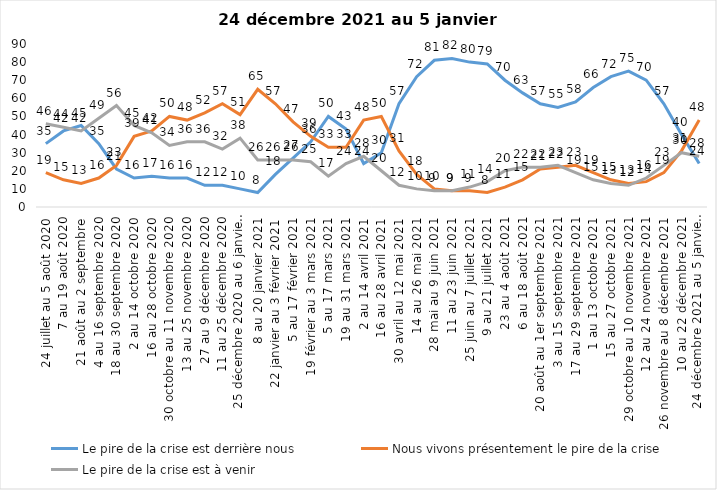
| Category | Le pire de la crise est derrière nous | Nous vivons présentement le pire de la crise | Le pire de la crise est à venir |
|---|---|---|---|
| 24 juillet au 5 août 2020 | 35 | 19 | 46 |
| 7 au 19 août 2020 | 42 | 15 | 44 |
| 21 août au 2 septembre | 45 | 13 | 42 |
| 4 au 16 septembre 2020 | 35 | 16 | 49 |
| 18 au 30 septembre 2020 | 21 | 23 | 56 |
| 2 au 14 octobre 2020 | 16 | 39 | 45 |
| 16 au 28 octobre 2020 | 17 | 42 | 41 |
| 30 octobre au 11 novembre 2020 | 16 | 50 | 34 |
| 13 au 25 novembre 2020 | 16 | 48 | 36 |
| 27 au 9 décembre 2020 | 12 | 52 | 36 |
| 11 au 25 décembre 2020 | 12 | 57 | 32 |
| 25 décembre 2020 au 6 janvier 2021 | 10 | 51 | 38 |
| 8 au 20 janvier 2021 | 8 | 65 | 26 |
| 22 janvier au 3 février 2021 | 18 | 57 | 26 |
| 5 au 17 février 2021 | 27 | 47 | 26 |
| 19 février au 3 mars 2021 | 36 | 39 | 25 |
| 5 au 17 mars 2021 | 50 | 33 | 17 |
| 19 au 31 mars 2021 | 43 | 33 | 24 |
| 2 au 14 avril 2021 | 24 | 48 | 28 |
| 16 au 28 avril 2021 | 30 | 50 | 20 |
| 30 avril au 12 mai 2021 | 57 | 31 | 12 |
| 14 au 26 mai 2021 | 72 | 18 | 10 |
| 28 mai au 9 juin 2021 | 81 | 10 | 9 |
| 11 au 23 juin 2021 | 82 | 9 | 9 |
| 25 juin au 7 juillet 2021 | 80 | 9 | 11 |
| 9 au 21 juillet 2021 | 79 | 8 | 14 |
| 23 au 4 août 2021 | 70 | 11 | 20 |
| 6 au 18 août 2021 | 63 | 15 | 22 |
| 20 août au 1er septembre 2021 | 57 | 21 | 22 |
| 3 au 15 septembre 2021 | 55 | 22 | 23 |
| 17 au 29 septembre 2021 | 58 | 23 | 19 |
| 1 au 13 octobre 2021 | 66 | 19 | 15 |
| 15 au 27 octobre 2021 | 72 | 15 | 13 |
| 29 octobre au 10 novembre 2021 | 75 | 13 | 12 |
| 12 au 24 novembre 2021 | 70 | 14 | 16 |
| 26 novembre au 8 décembre 2021 | 57 | 19 | 23 |
| 10 au 22 décembre 2021 | 40 | 31 | 30 |
| 24 décembre 2021 au 5 janvier 2022 | 24 | 48 | 28 |